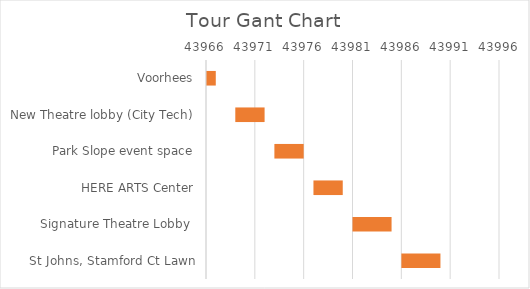
| Category | Series 0 | Duration |
|---|---|---|
| Voorhees | 43965 | 2 |
| New Theatre lobby (City Tech) | 43969 | 3 |
| Park Slope event space | 43973 | 3 |
| HERE ARTS Center | 43977 | 3 |
| Signature Theatre Lobby  | 43981 | 4 |
| St Johns, Stamford Ct Lawn | 43986 | 4 |